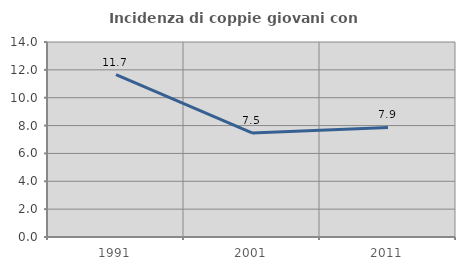
| Category | Incidenza di coppie giovani con figli |
|---|---|
| 1991.0 | 11.663 |
| 2001.0 | 7.473 |
| 2011.0 | 7.863 |